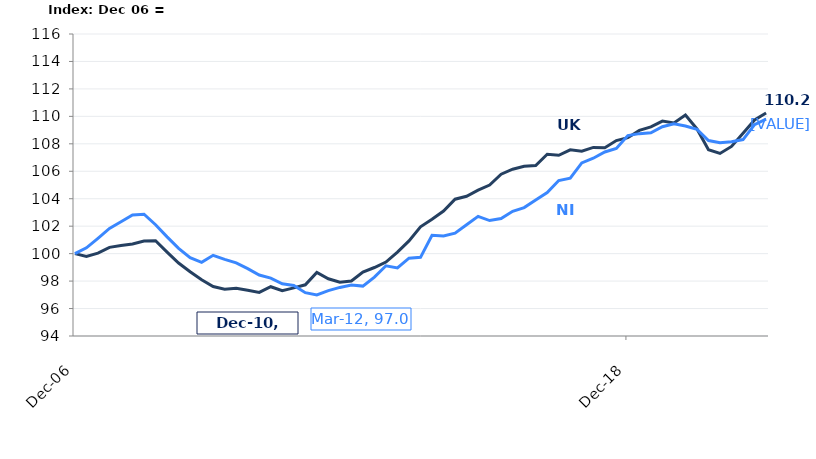
| Category | UK |
|---|---|
| 2006-12-01 | 100 |
| 2007-03-01 | 99.801 |
| 2007-06-01 | 100.039 |
| 2007-09-01 | 100.455 |
| 2007-12-01 | 100.591 |
| 2008-03-01 | 100.708 |
| 2008-06-01 | 100.915 |
| 2008-09-01 | 100.936 |
| 2008-12-01 | 100.107 |
| 2009-03-01 | 99.313 |
| 2009-06-01 | 98.687 |
| 2009-09-01 | 98.093 |
| 2009-12-01 | 97.605 |
| 2010-03-01 | 97.413 |
| 2010-06-01 | 97.484 |
| 2010-09-01 | 97.327 |
| 2010-12-01 | 97.174 |
| 2011-03-01 | 97.591 |
| 2011-06-01 | 97.303 |
| 2011-09-01 | 97.505 |
| 2011-12-01 | 97.73 |
| 2012-03-01 | 98.626 |
| 2012-06-01 | 98.171 |
| 2012-09-01 | 97.918 |
| 2012-12-01 | 98.007 |
| 2013-03-01 | 98.662 |
| 2013-06-01 | 98.989 |
| 2013-09-01 | 99.388 |
| 2013-12-01 | 100.117 |
| 2014-03-01 | 100.929 |
| 2014-06-01 | 101.957 |
| 2014-09-01 | 102.505 |
| 2014-12-01 | 103.1 |
| 2015-03-01 | 103.964 |
| 2015-06-01 | 104.181 |
| 2015-09-01 | 104.626 |
| 2015-12-01 | 105 |
| 2016-03-01 | 105.786 |
| 2016-06-01 | 106.149 |
| 2016-09-01 | 106.37 |
| 2016-12-01 | 106.423 |
| 2017-03-01 | 107.242 |
| 2017-06-01 | 107.167 |
| 2017-09-01 | 107.562 |
| 2017-12-01 | 107.459 |
| 2018-03-01 | 107.736 |
| 2018-06-01 | 107.708 |
| 2018-09-01 | 108.235 |
| 2018-12-01 | 108.448 |
| 2019-03-01 | 108.975 |
| 2019-06-01 | 109.238 |
| 2019-09-01 | 109.654 |
| 2019-12-01 | 109.523 |
| 2020-03-01 | 110.096 |
| 2020-06-01 | 109.082 |
| 2020-09-01 | 107.566 |
| 2020-12-01 | 107.299 |
| 2021-03-01 | 107.808 |
| 2021-06-01 | 108.765 |
| 2021-09-01 | 109.74 |
| 2021-12-01 | 110.249 |